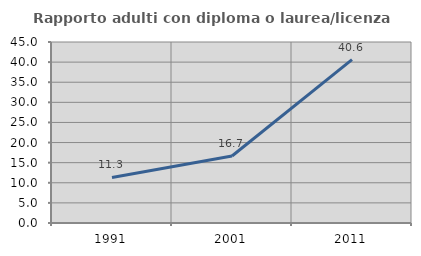
| Category | Rapporto adulti con diploma o laurea/licenza media  |
|---|---|
| 1991.0 | 11.321 |
| 2001.0 | 16.667 |
| 2011.0 | 40.625 |